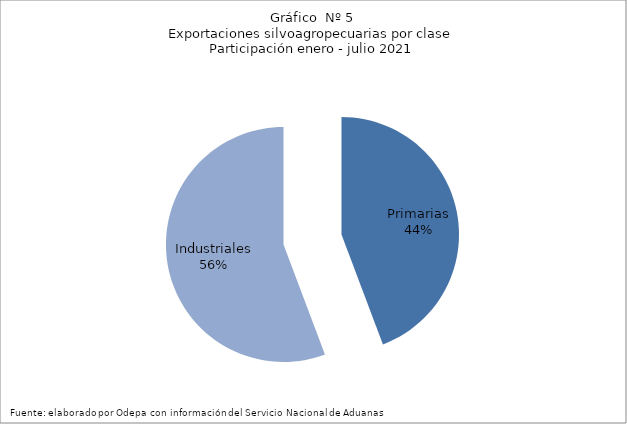
| Category | Series 0 |
|---|---|
| Primarias | 4671740 |
| Industriales | 5883037 |